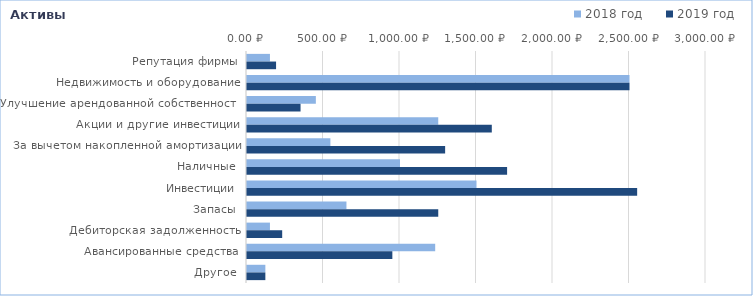
| Category | 2018 год | 2019 год |
|---|---|---|
| Репутация фирмы | 150 | 190 |
| Недвижимость и оборудование | 2500 | 2500 |
| Улучшение арендованной собственности | 450 | 350 |
| Акции и другие инвестиции | 1250 | 1600 |
| За вычетом накопленной амортизации | 545 | 1295 |
| Наличные | 1000 | 1700 |
| Инвестиции | 1500 | 2550 |
| Запасы | 650 | 1250 |
| Дебиторская задолженность | 150 | 230 |
| Авансированные средства | 1230 | 950 |
| Другое | 120 | 120 |